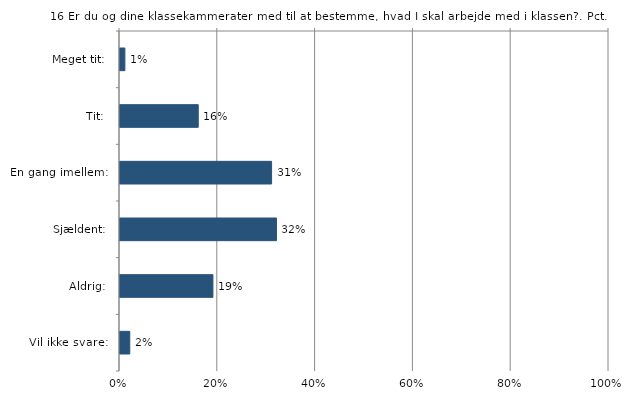
| Category | Er du og dine klassekammerater med til at bestemme, hvad I skal arbejde med i klassen? |
|---|---|
| Meget tit:  | 0.01 |
| Tit:  | 0.16 |
| En gang imellem:  | 0.31 |
| Sjældent:  | 0.32 |
| Aldrig:  | 0.19 |
| Vil ikke svare:  | 0.02 |